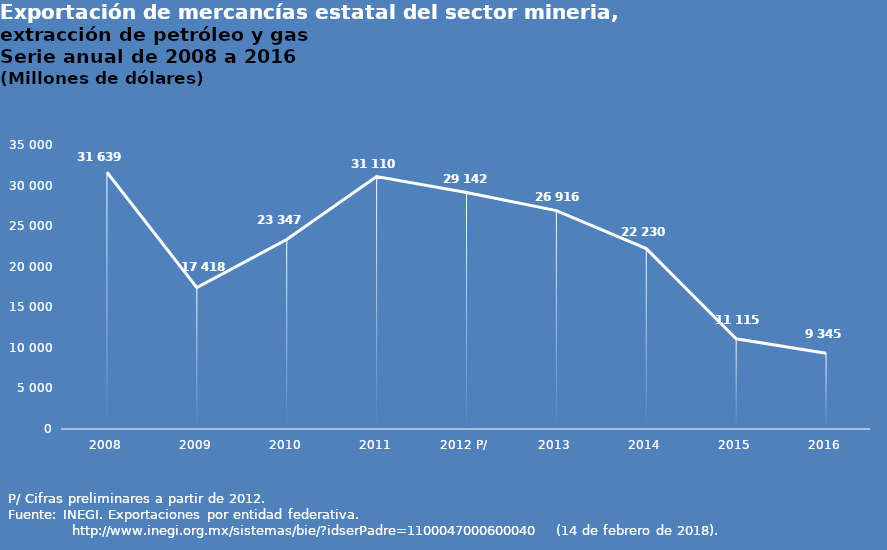
| Category | Series 0 |
|---|---|
| 2008 | 31639.326 |
| 2009 | 17417.546 |
| 2010 | 23347.034 |
| 2011 | 31109.774 |
| 2012 P/ | 29141.686 |
| 2013 | 26915.61 |
| 2014 | 22230.379 |
| 2015 | 11114.646 |
| 2016 | 9344.89 |